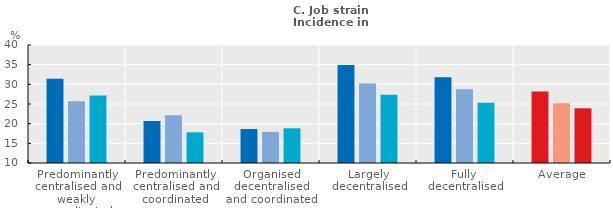
| Category | 2005 | 2010 | 2015 |
|---|---|---|---|
| Predominantly centralised and weakly co-ordinated | 31.439 | 25.727 | 27.161 |
| Predominantly centralised and coordinated | 20.684 | 22.133 | 17.798 |
| Organised decentralised and coordinated | 18.629 | 17.923 | 18.822 |
| Largely decentralised | 34.943 | 30.186 | 27.382 |
| Fully decentralised | 31.814 | 28.72 | 25.3 |
| Average | 28.19 | 25.179 | 23.898 |